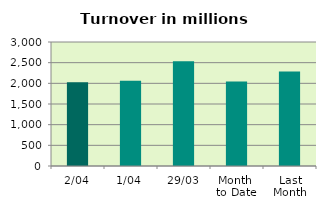
| Category | Series 0 |
|---|---|
| 2/04 | 2025.341 |
| 1/04 | 2064.644 |
| 29/03 | 2536.994 |
| Month 
to Date | 2044.992 |
| Last
Month | 2286.259 |